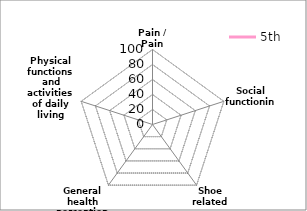
| Category | 5th |
|---|---|
| Pain / Pain related | 0 |
| Social functioning | 0 |
| Shoe related | 0 |
| General health perceptions | 0 |
| Physical functions and activities of daily living (ADL) | 0 |